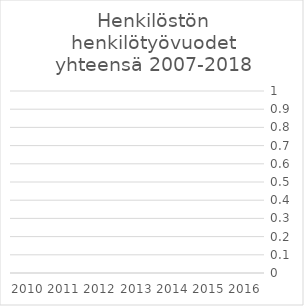
| Category | Todelliset henkilötyövuodet yhteensä |
|---|---|
| 2016.0 | 0 |
| 2015.0 | 0 |
| 2014.0 | 0 |
| 2013.0 | 0 |
| 2012.0 | 0 |
| 2011.0 | 0 |
| 2010.0 | 0 |